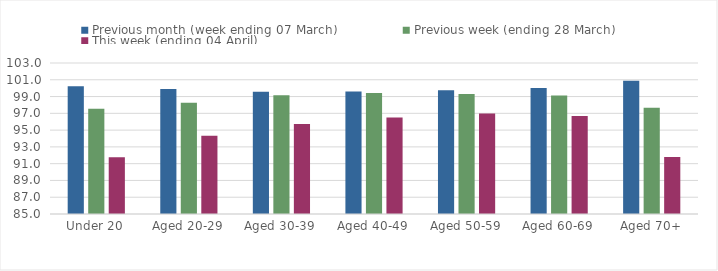
| Category | Previous month (week ending 07 March) | Previous week (ending 28 March) | This week (ending 04 April) |
|---|---|---|---|
| Under 20 | 100.233 | 97.557 | 91.755 |
| Aged 20-29 | 99.906 | 98.271 | 94.339 |
| Aged 30-39 | 99.576 | 99.162 | 95.735 |
| Aged 40-49 | 99.591 | 99.412 | 96.506 |
| Aged 50-59 | 99.744 | 99.308 | 96.989 |
| Aged 60-69 | 100.015 | 99.132 | 96.671 |
| Aged 70+ | 100.874 | 97.657 | 91.793 |